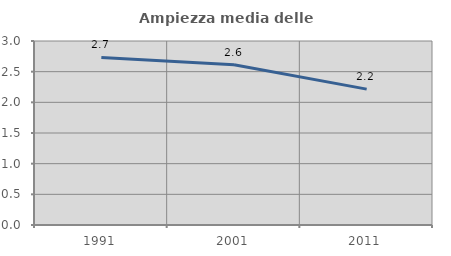
| Category | Ampiezza media delle famiglie |
|---|---|
| 1991.0 | 2.733 |
| 2001.0 | 2.612 |
| 2011.0 | 2.216 |